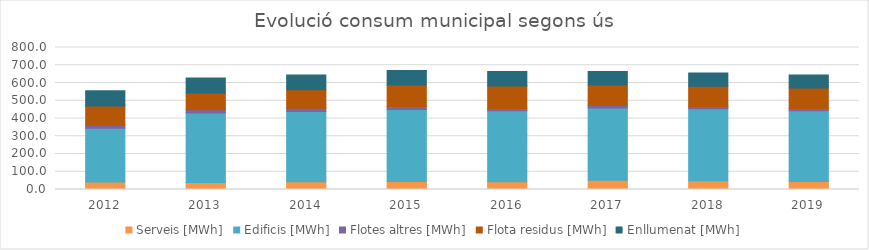
| Category | Serveis [MWh] | Edificis [MWh] | Flotes altres [MWh] | Flota residus [MWh] | Enllumenat [MWh] |
|---|---|---|---|---|---|
| 2012.0 | 42.956 | 302.559 | 16.79 | 108.485 | 86.21 |
| 2013.0 | 40.124 | 390.223 | 18.985 | 94.689 | 84.773 |
| 2014.0 | 44.105 | 395.481 | 18.009 | 104.38 | 83.169 |
| 2015.0 | 44.794 | 406.486 | 16.577 | 120.722 | 81.538 |
| 2016.0 | 44.104 | 398.929 | 13.673 | 125.924 | 81.508 |
| 2017.0 | 52.199 | 406.64 | 14.187 | 116.238 | 75.621 |
| 2018.0 | 48.911 | 405.459 | 13.336 | 113.598 | 74.676 |
| 2019.0 | 45.205 | 398.596 | 13.014 | 114.845 | 72.756 |